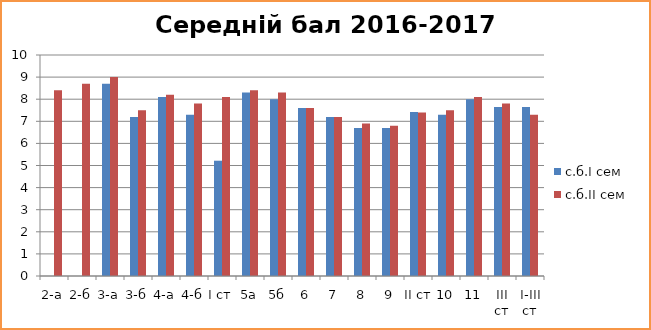
| Category | с.б.І сем | с.б.ІІ сем |
|---|---|---|
| 2-а | 0 | 8.4 |
| 2-б | 0 | 8.7 |
| 3-а | 8.7 | 9 |
| 3-б | 7.2 | 7.5 |
| 4-а | 8.1 | 8.2 |
| 4-б | 7.3 | 7.8 |
| І ст | 5.217 | 8.1 |
| 5а | 8.3 | 8.4 |
| 5б | 8 | 8.3 |
| 6 | 7.6 | 7.6 |
| 7 | 7.2 | 7.2 |
| 8 | 6.7 | 6.9 |
| 9 | 6.7 | 6.8 |
| ІІ ст | 7.417 | 7.4 |
| 10 | 7.3 | 7.5 |
| 11 | 8 | 8.1 |
| ІІІ ст | 7.65 | 7.8 |
| І-ІІІ ст | 7.65 | 7.3 |